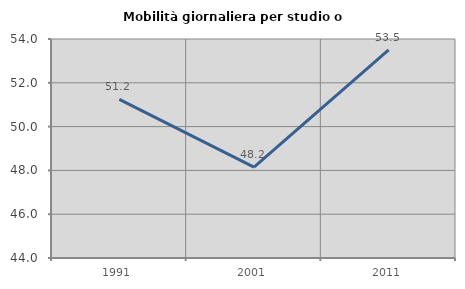
| Category | Mobilità giornaliera per studio o lavoro |
|---|---|
| 1991.0 | 51.24 |
| 2001.0 | 48.153 |
| 2011.0 | 53.503 |